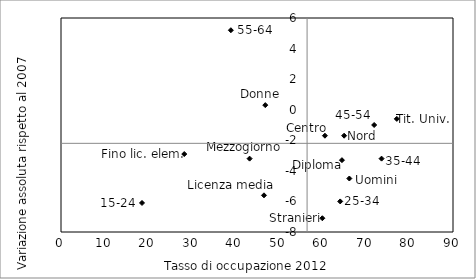
| Category | Series 0 |
|---|---|
| 66.2 | -4.5 |
| 46.9 | 0.3 |
| 65.0 | -1.7 |
| 60.6 | -1.7 |
| 43.3 | -3.2 |
| 18.6 | -6.1 |
| 64.1 | -6 |
| 73.6 | -3.2 |
| 71.9 | -1 |
| 39.0 | 5.2 |
| 28.3 | -2.9 |
| 46.6 | -5.6 |
| 64.5 | -3.3 |
| 77.1 | -0.6 |
| 60.0 | -7.1 |